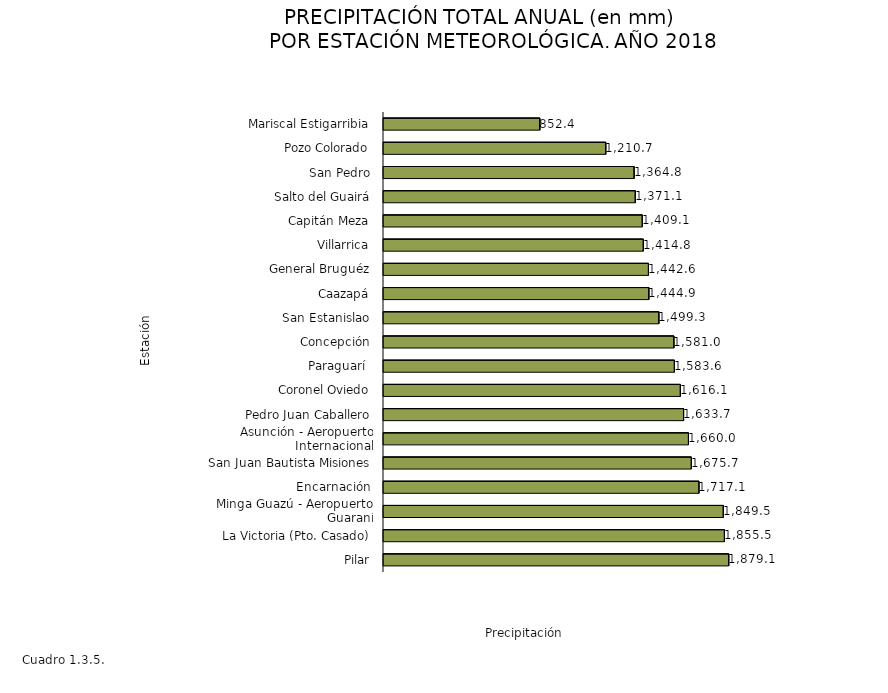
| Category | Series 0 |
|---|---|
| Pilar | 1879.1 |
| La Victoria (Pto. Casado) | 1855.5 |
| Minga Guazú - Aeropuerto Guaraní | 1849.5 |
| Encarnación | 1717.1 |
| San Juan Bautista Misiones | 1675.7 |
| Asunción - Aeropuerto Internacional | 1660 |
| Pedro Juan Caballero | 1633.7 |
| Coronel Oviedo | 1616.1 |
| Paraguarí  | 1583.6 |
| Concepción | 1581 |
| San Estanislao | 1499.3 |
| Caazapá | 1444.9 |
| General Bruguéz | 1442.6 |
| Villarrica | 1414.8 |
| Capitán Meza | 1409.1 |
| Salto del Guairá | 1371.1 |
| San Pedro | 1364.8 |
| Pozo Colorado | 1210.7 |
| Mariscal Estigarribia | 852.4 |